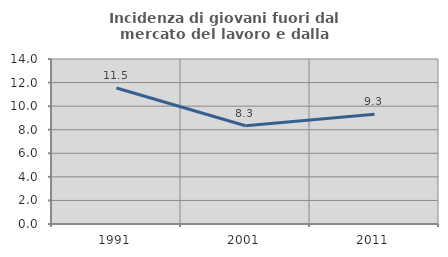
| Category | Incidenza di giovani fuori dal mercato del lavoro e dalla formazione  |
|---|---|
| 1991.0 | 11.538 |
| 2001.0 | 8.333 |
| 2011.0 | 9.302 |